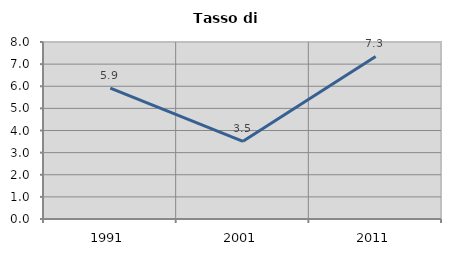
| Category | Tasso di disoccupazione   |
|---|---|
| 1991.0 | 5.912 |
| 2001.0 | 3.51 |
| 2011.0 | 7.349 |